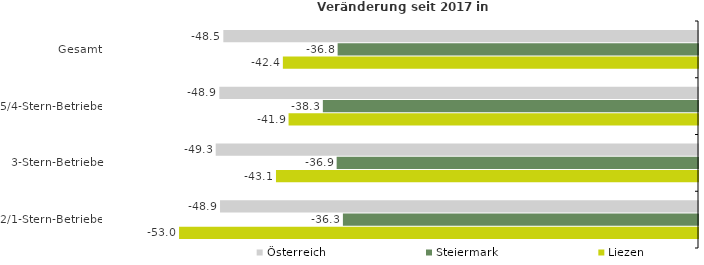
| Category | Österreich | Steiermark | Liezen |
|---|---|---|---|
| Gesamt | -48.519 | -36.835 | -42.432 |
| 5/4-Stern-Betriebe | -48.928 | -38.346 | -41.85 |
| 3-Stern-Betriebe | -49.297 | -36.936 | -43.136 |
| 2/1-Stern-Betriebe | -48.857 | -36.296 | -53.045 |